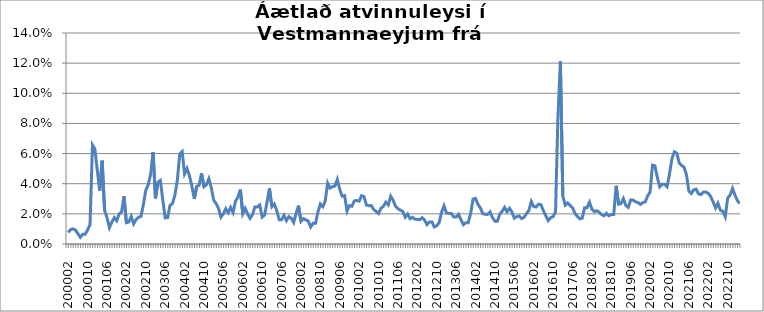
| Category | Series 0 |
|---|---|
| 200002 | 0.008 |
| 200003 | 0.01 |
| 200004 | 0.01 |
| 200005 | 0.009 |
| 200006 | 0.007 |
| 200007 | 0.004 |
| 200008 | 0.006 |
| 200009 | 0.006 |
| 200010 | 0.009 |
| 200011 | 0.013 |
| 200012 | 0.066 |
| 200101 | 0.063 |
| 200102 | 0.049 |
| 200103 | 0.035 |
| 200104 | 0.055 |
| 200105 | 0.022 |
| 200106 | 0.017 |
| 200107 | 0.011 |
| 200108 | 0.015 |
| 200109 | 0.017 |
| 200110 | 0.015 |
| 200111 | 0.02 |
| 200112 | 0.021 |
| 200201 | 0.032 |
| 200202 | 0.014 |
| 200203 | 0.015 |
| 200204 | 0.018 |
| 200205 | 0.013 |
| 200206 | 0.016 |
| 200207 | 0.018 |
| 200208 | 0.018 |
| 200209 | 0.026 |
| 200210 | 0.036 |
| 200211 | 0.039 |
| 200212 | 0.046 |
| 200301 | 0.061 |
| 200302 | 0.03 |
| 200303 | 0.041 |
| 200304 | 0.042 |
| 200305 | 0.029 |
| 200306 | 0.017 |
| 200307 | 0.017 |
| 200308 | 0.026 |
| 200309 | 0.027 |
| 200310 | 0.032 |
| 200311 | 0.042 |
| 200312 | 0.06 |
| 200401 | 0.061 |
| 200402 | 0.047 |
| 200403 | 0.05 |
| 200404 | 0.045 |
| 200405 | 0.038 |
| 200406 | 0.03 |
| 200407 | 0.038 |
| 200408 | 0.039 |
| 200409 | 0.047 |
| 200410 | 0.038 |
| 200411 | 0.039 |
| 200412 | 0.043 |
| 200501 | 0.037 |
| 200502 | 0.029 |
| 200503 | 0.027 |
| 200504 | 0.023 |
| 200505 | 0.018 |
| 200506 | 0.02 |
| 200507 | 0.023 |
| 200508 | 0.021 |
| 200509 | 0.024 |
| 200510 | 0.021 |
| 200511 | 0.028 |
| 200512 | 0.031 |
| 200601 | 0.036 |
| 200602 | 0.02 |
| 200603 | 0.024 |
| 200604 | 0.02 |
| 200605 | 0.017 |
| 200606 | 0.02 |
| 200607 | 0.025 |
| 200608 | 0.025 |
| 200609 | 0.026 |
| 200610 | 0.018 |
| 200611 | 0.019 |
| 200612 | 0.028 |
| 200701 | 0.037 |
| 200702 | 0.025 |
| 200703 | 0.027 |
| 200704 | 0.022 |
| 200705 | 0.016 |
| 200706 | 0.016 |
| 200707 | 0.019 |
| 200708 | 0.016 |
| 200709 | 0.018 |
| 200710 | 0.017 |
| 200711 | 0.014 |
| 200712 | 0.02 |
| 200801 | 0.025 |
| 200802 | 0.015 |
| 200803 | 0.017 |
| 200804 | 0.016 |
| 200805 | 0.015 |
| 200806 | 0.011 |
| 200807 | 0.014 |
| 200808 | 0.014 |
| 200809 | 0.021 |
| 200810 | 0.027 |
| 200811 | 0.025 |
| 200812 | 0.028 |
| 200901 | 0.04 |
| 200902 | 0.037 |
| 200903 | 0.038 |
| 200904 | 0.038 |
| 200905 | 0.043 |
| 200906 | 0.036 |
| 200907 | 0.032 |
| 200908 | 0.032 |
| 200909 | 0.022 |
| 200910 | 0.025 |
| 200911 | 0.025 |
| 200912 | 0.029 |
| 201001 | 0.029 |
| 201002 | 0.028 |
| 201003 | 0.032 |
| 201004 | 0.031 |
| 201005 | 0.026 |
| 201006 | 0.025 |
| 201007 | 0.026 |
| 201008 | 0.023 |
| 201009 | 0.022 |
| 201010 | 0.02 |
| 201011 | 0.024 |
| 201012 | 0.025 |
| 201101 | 0.028 |
| 201102 | 0.026 |
| 201103 | 0.032 |
| 201104 | 0.029 |
| 201105 | 0.025 |
| 201106 | 0.023 |
| 201107 | 0.022 |
| 201108 | 0.022 |
| 201109 | 0.018 |
| 201110 | 0.02 |
| 201111 | 0.017 |
| 201112 | 0.018 |
| 201201 | 0.017 |
| 201202 | 0.017 |
| 201203 | 0.016 |
| 201204 | 0.017 |
| 201205 | 0.016 |
| 201206 | 0.013 |
| 201207 | 0.015 |
| 201208 | 0.015 |
| 201209 | 0.011 |
| 201210 | 0.012 |
| 201211 | 0.014 |
| 201212 | 0.021 |
| 201301 | 0.025 |
| 201302 | 0.021 |
| 201303 | 0.02 |
| 201304 | 0.02 |
| 201305 | 0.018 |
| 201306 | 0.018 |
| 201307 | 0.02 |
| 201308 | 0.016 |
| 201309 | 0.013 |
| 201310 | 0.014 |
| 201311 | 0.014 |
| 201312 | 0.02 |
| 201401 | 0.03 |
| 201402 | 0.03 |
| 201403 | 0.026 |
| 201404 | 0.024 |
| 201405 | 0.02 |
| 201406 | 0.02 |
| 201407 | 0.02 |
| 201408 | 0.021 |
| 201409 | 0.017 |
| 201410 | 0.015 |
| 201411 | 0.015 |
| 201412 | 0.02 |
| 201501 | 0.022 |
| 201502 | 0.024 |
| 201503 | 0.021 |
| 201504 | 0.024 |
| 201505 | 0.021 |
| 201506 | 0.017 |
| 201507 | 0.018 |
| 201508 | 0.019 |
| 201509 | 0.017 |
| 201510 | 0.018 |
| 201511 | 0.02 |
| 201512 | 0.022 |
| 201601 | 0.028 |
| 201602 | 0.025 |
| 201603 | 0.025 |
| 201604 | 0.026 |
| 201605 | 0.026 |
| 201606 | 0.022 |
| 201607 | 0.019 |
| 201608 | 0.016 |
| 201609 | 0.018 |
| 201610 | 0.018 |
| 201611 | 0.021 |
| 201612 | 0.085 |
| 201701 | 0.121 |
| 201702 | 0.032 |
| 201703 | 0.026 |
| 201704 | 0.027 |
| 201705 | 0.026 |
| 201706 | 0.024 |
| 201707 | 0.02 |
| 201708 | 0.018 |
| 201709 | 0.017 |
| 201710 | 0.017 |
| 201711 | 0.024 |
| 201712 | 0.024 |
| 201801 | 0.028 |
| 201802 | 0.023 |
| 201803 | 0.022 |
| 201804 | 0.022 |
| 201805 | 0.021 |
| 201806 | 0.02 |
| 201807 | 0.019 |
| 201808 | 0.02 |
| 201809 | 0.019 |
| 201810 | 0.02 |
| 201811 | 0.02 |
| 201812 | 0.039 |
| 201901 | 0.026 |
| 201902 | 0.027 |
| 201903 | 0.03 |
| 201904 | 0.026 |
| 201905 | 0.024 |
| 201906 | 0.029 |
| 201907 | 0.029 |
| 201908 | 0.028 |
| 201909 | 0.028 |
| 201910 | 0.026 |
| 201911 | 0.027 |
| 201912 | 0.028 |
| 202001 | 0.032 |
| 202002 | 0.035 |
| 202003 | 0.052 |
| 202004 | 0.052 |
| 202005 | 0.044 |
| 202006 | 0.038 |
| 202007 | 0.04 |
| 202008 | 0.04 |
| 202009 | 0.038 |
| 202010 | 0.046 |
| 202011 | 0.056 |
| 202012 | 0.061 |
| 202101 | 0.06 |
| 202102 | 0.054 |
| 202103 | 0.052 |
| 202104 | 0.051 |
| 202105 | 0.046 |
| 202106 | 0.035 |
| 202107 | 0.033 |
| 202108 | 0.036 |
| 202109 | 0.036 |
| 202110 | 0.033 |
| 202111 | 0.033 |
| 202112 | 0.034 |
| 202201 | 0.034 |
| 202202 | 0.034 |
| 202203 | 0.032 |
| 202204 | 0.028 |
| 202205 | 0.024 |
| 202206 | 0.027 |
| 202207 | 0.022 |
| 202208 | 0.022 |
| 202209 | 0.018 |
| 202210 | 0.03 |
| 202211 | 0.032 |
| 202212 | 0.037 |
| 202301 | 0.032 |
| 202302 | 0.029 |
| 202303 | 0.027 |